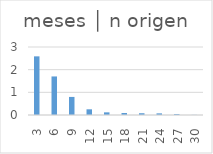
| Category | meses │ n origen |
|---|---|
| 3.0 | 2.587 |
| 6.0 | 1.701 |
| 9.0 | 0.797 |
| 12.0 | 0.251 |
| 15.0 | 0.117 |
| 18.0 | 0.089 |
| 21.0 | 0.078 |
| 24.0 | 0.072 |
| 27.0 | 0.039 |
| 30.0 | 0.006 |